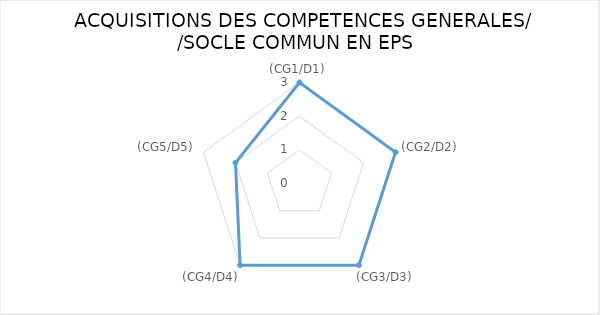
| Category | Series 0 | "" | 1 | 2 | 3 | 4 |
|---|---|---|---|---|---|---|
| (CG1/D1) | 3 |  |  |  |  |  |
| (CG2/D2) | 3 |  |  |  |  |  |
| (CG3/D3) | 3 |  |  |  |  |  |
| (CG4/D4) | 3 |  |  |  |  |  |
| (CG5/D5) | 2 |  |  |  |  |  |